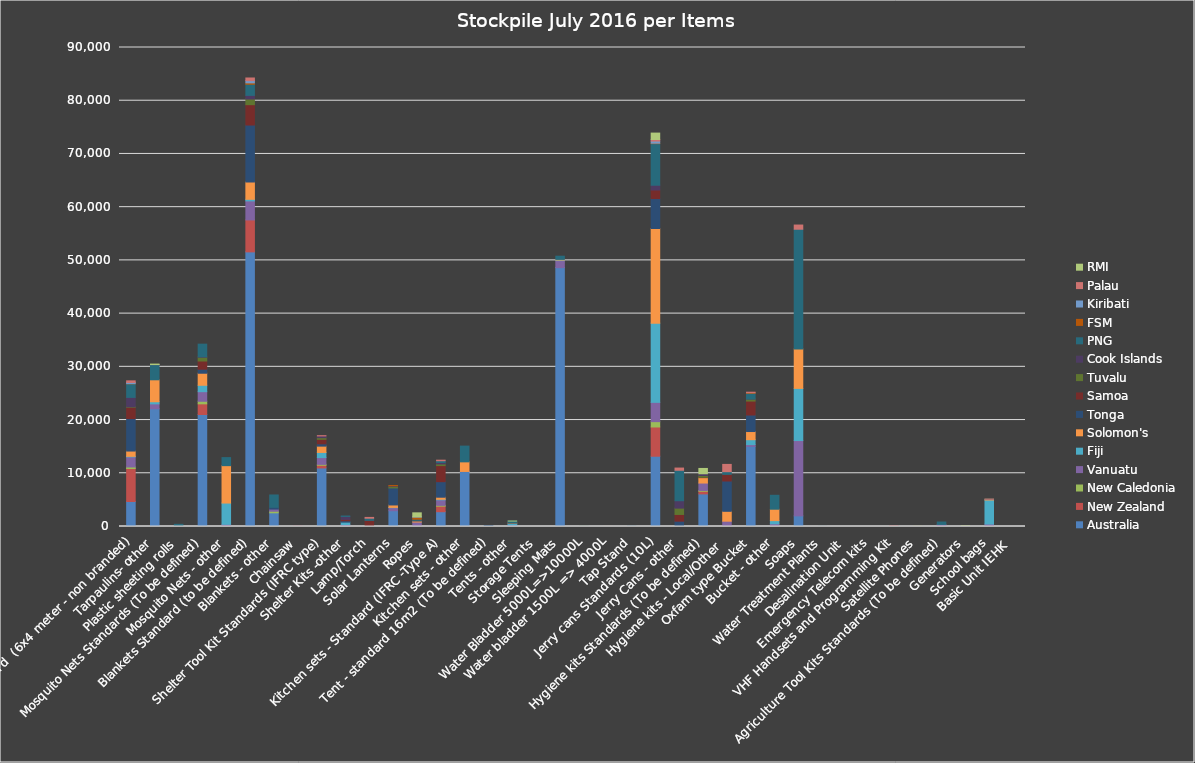
| Category | Australia | New Zealand | New Caledonia | Vanuatu | Fiji | Solomon's | Tonga | Samoa | Tuvalu | Cook Islands | PNG | FSM | Kiribati | Palau | RMI |
|---|---|---|---|---|---|---|---|---|---|---|---|---|---|---|---|
| Tarpaulins Standard  (6x4 meter - non branded) | 4701 | 6199 | 285 | 1895 | 103 | 993 | 6100 | 2135 | 73 | 1777 | 2553 | 31 | 222 | 300 | 0 |
| Tarpaulins- other | 22126 | 0 | 0 | 920 | 395 | 4124 | 0 | 0 | 0 | 0 | 2853 | 0 | 0 | 24 | 75 |
| Plastic sheeting rolls | 0 | 0 | 0 | 2 | 0 | 0 | 6 | 6 | 0 | 0 | 394 | 0 | 0 | 0 | 0 |
| Mosquito Nets Standards (To be defined) | 21048 | 2000 | 480 | 1806 | 1200 | 2262 | 750 | 1549 | 714 | 80 | 2370 | 0 | 0 | 0 | 0 |
| Mosquito Nets - other | 0 | 0 | 0 | 406 | 4000 | 7026 | 0 | 0 | 0 | 0 | 1510 | 0 | 0 | 0 | 0 |
| Blankets Standard (to be defined) | 51600 | 6000 | 0 | 3577 | 299 | 3252 | 10701 | 3831 | 1067 | 679 | 2084 | 267 | 414 | 500 | 0 |
| Blankets - other | 2572 | 0 | 294 | 410 | 0 | 0 | 335 | 0 | 0 | 0 | 2310 | 0 | 0 | 0 | 0 |
| Chainsaw | 0 | 20 | 0 | 1 | 0 | 0 | 0 | 0 | 0 | 0 | 0 | 0 | 0 | 3 | 0 |
| Shelter Tool Kit Standards (IFRC type) | 11000 | 505 | 170 | 1275 | 964 | 1187 | 434 | 851 | 304 | 326 | 0 | 0 | 0 | 50 | 0 |
| Shelter Kits -other | 0 | 0 | 0 | 339 | 482 | 0 | 258 | 260 | 0 | 556 | 68 | 0 | 0 | 0 | 0 |
| Lamp/Torch | 0 | 0 | 0 | 9 | 20 | 0 | 0 | 1126 | 0 | 0 | 400 | 0 | 0 | 150 | 0 |
| Solar Lanterns | 2964 | 0 | 0 | 575 | 50 | 457 | 3206 | 0 | 277 | 119 | 0 | 50 | 0 | 0 | 0 |
| Ropes | 0 | 0 | 0 | 838 | 0 | 200 | 100 | 13 | 0 | 0 | 218 | 400 | 46 | 0 | 750 |
| Kitchen sets - Standard (IFRC -Type A) | 2780 | 1040 | 151 | 1037 | 106 | 386 | 2921 | 3025 | 313 | 269 | 331 | 0 | 0 | 100 | 0 |
| Kitchen sets - other | 10340 | 0 | 0 | 5 | 0 | 1801 | 0 | 0 | 0 | 0 | 2958 | 0 | 0 | 0 | 0 |
| Tent - standard 16m2 (To be defined) | 0 | 0 | 3 | 0 | 84 | 0 | 105 | 0 | 0 | 0 | 0 | 0 | 0 | 0 | 0 |
| Tents - other | 278 | 0 | 0 | 18 | 344 | 43 | 0 | 3 | 0 | 0 | 339 | 0 | 0 | 0 | 1 |
| Storage Tents | 0 | 0 | 1 | 0 | 2 | 0 | 0 | 0 | 0 | 0 | 0 | 0 | 0 | 0 | 0 |
| Sleeping Mats | 48641 | 0 | 0 | 1325 | 100 | 119 | 0 | 0 | 0 | 0 | 600 | 0 | 0 | 0 | 0 |
| Water Bladder 5000L=>10000L | 13 | 5 | 2 | 0 | 9 | 6 | 0 | 0 | 0 | 0 | 10 | 0 | 0 | 0 | 0 |
| Water bladder 1500L => 4000L | 17 | 0 | 0 | 2 | 5 | 8 | 0 | 0 | 0 | 0 | 0 | 0 | 0 | 0 | 0 |
| Tap Stand | 7 | 5 | 0 | 0 | 4 | 0 | 6 | 0 | 0 | 0 | 1 | 0 | 0 | 0 | 0 |
| Jerry cans Standards (10L) | 13200 | 5500 | 1000 | 3628 | 14884 | 17784 | 5616 | 1612 | 0 | 900 | 7814 | 80 | 400 | 300 | 1200 |
| Jerry Cans - other | 0 | 0 | 0 | 0 | 0 | 0 | 1000 | 1264 | 1185 | 1397 | 5720 | 0 | 0 | 414 | 0 |
| Hygiene kits Standards (To be defined) | 6121 | 500 | 150 | 1394 | 0 | 1013 | 0 | 77 | 322 | 330 | 0 | 0 | 0 | 0 | 1000 |
| Hygiene kits - Local/Other  | 0 | 0 | 0 | 1000 | 0 | 1855 | 5691 | 1250 | 0 | 0 | 501 | 0 | 0 | 1369 | 0 |
| Oxfam type Bucket | 15064 | 0 | 0 | 319 | 930 | 1530 | 3102 | 2625 | 375 | 16 | 1080 | 91 | 0 | 100 | 0 |
| Bucket - other | 0 | 0 | 0 | 504 | 600 | 2142 | 0 | 0 | 0 | 0 | 2616 | 0 | 0 | 0 | 0 |
| Soaps | 2000 | 0 | 0 | 14150 | 9800 | 7404 | 0 | 0 | 0 | 0 | 22500 | 0 | 0 | 787 | 0 |
| Water Treatment Plants | 4 | 0 | 2 | 0 | 3 | 0 | 0 | 0 | 0 | 1 | 2 | 0 | 0 | 0 | 0 |
| Desalination Unit | 2 | 0 | 0 | 0 | 0 | 0 | 1 | 0 | 0 | 2 | 0 | 0 | 0 | 0 | 0 |
| Emergency Telecom kits | 0 | 0 | 0 | 0 | 0 | 0 | 0 | 0 | 0 | 0 | 0 | 0 | 0 | 0 | 1 |
| VHF Handsets and Programming Kit | 0 | 10 | 0 | 0 | 9 | 0 | 0 | 0 | 0 | 1 | 112 | 0 | 0 | 2 | 0 |
| Satellite Phones | 0 | 6 | 2 | 6 | 8 | 0 | 0 | 0 | 0 | 5 | 12 | 0 | 0 | 6 | 6 |
| Agriculture Tool Kits Standards (To be defined) | 0 | 150 | 0 | 234 | 0 | 0 | 0 | 0 | 0 | 0 | 456 | 0 | 0 | 0 | 0 |
| Generators | 41 | 10 | 4 | 13 | 10 | 0 | 0 | 0 | 0 | 0 | 3 | 0 | 0 | 2 | 34 |
| School bags | 0 | 0 | 0 | 458 | 4520 | 138 | 0 | 0 | 0 | 0 | 5 | 0 | 0 | 9 | 0 |
| Basic Unit IEHK  | 0 | 0 | 0 | 0 | 0 | 0 | 0 | 0 | 0 | 0 | 0 | 0 | 0 | 0 | 0 |